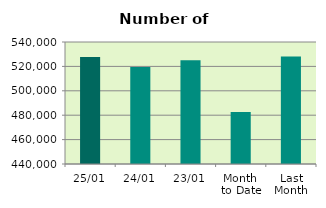
| Category | Series 0 |
|---|---|
| 25/01 | 527608 |
| 24/01 | 519490 |
| 23/01 | 525070 |
| Month 
to Date | 482560.222 |
| Last
Month | 528134.632 |